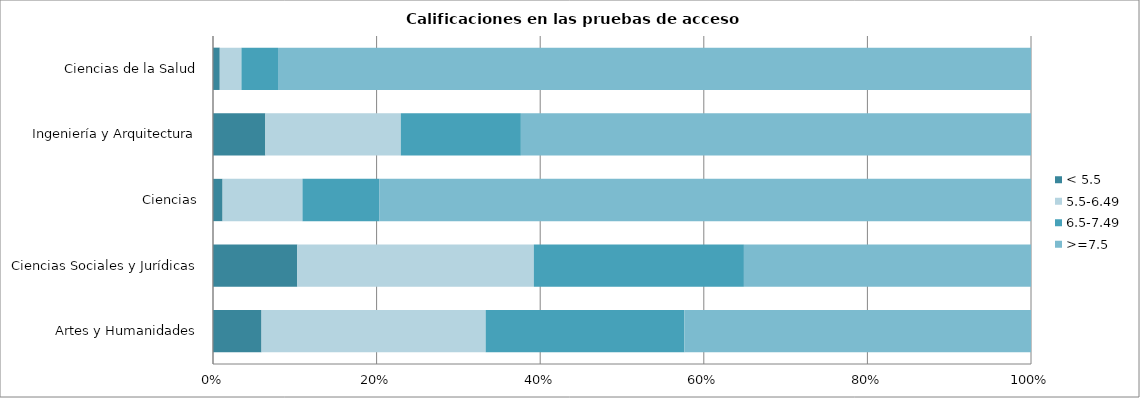
| Category | < 5.5 | 5.5-6.49 | 6.5-7.49 | >=7.5 |
|---|---|---|---|---|
| Artes y Humanidades | 21 | 97 | 86 | 150 |
| Ciencias Sociales y Jurídicas | 230 | 645 | 573 | 783 |
| Ciencias | 3 | 25 | 24 | 204 |
| Ingeniería y Arquitectura | 58 | 150 | 133 | 565 |
| Ciencias de la Salud | 5 | 16 | 27 | 556 |